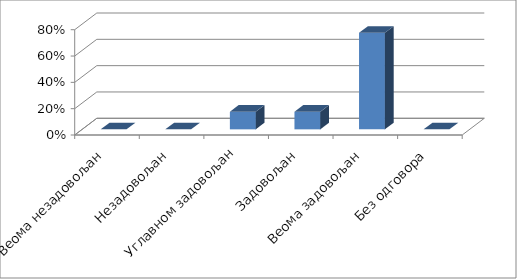
| Category | Series 0 |
|---|---|
| Веома незадовољан | 0 |
| Незадовољан | 0 |
| Углавном задовољан | 0.133 |
| Задовољан | 0.133 |
| Веома задовољан | 0.733 |
| Без одговора | 0 |